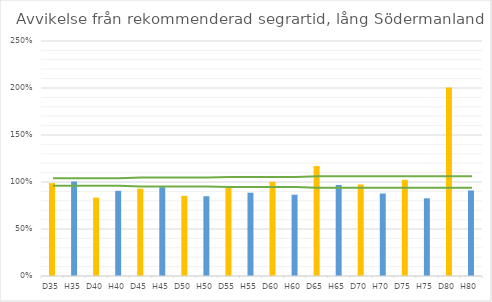
| Category | Avvikelse |
|---|---|
| D35 | 0.988 |
| H35 | 1.005 |
| D40 | 0.833 |
| H40 | 0.906 |
| D45 | 0.929 |
| H45 | 0.945 |
| D50 | 0.853 |
| H50 | 0.849 |
| D55 | 0.936 |
| H55 | 0.886 |
| D60 | 1.002 |
| H60 | 0.865 |
| D65 | 1.17 |
| H65 | 0.969 |
| D70 | 0.974 |
| H70 | 0.877 |
| D75 | 1.023 |
| H75 | 0.827 |
| D80 | 2.004 |
| H80 | 0.91 |